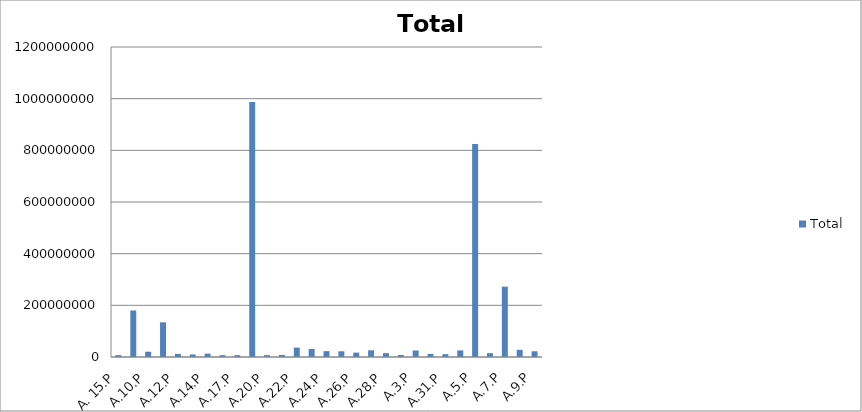
| Category | Total |
|---|---|
| A. 15.P | 7250000 |
| A.1.P | 180160000 |
| A.10.P | 20410000 |
| A.11.P | 134260000 |
| A.12.P | 12065000 |
| A.13.P | 9880000 |
| A.14.P | 12880000 |
| A.16.P | 7065000 |
| A.17.P | 7050000 |
| A.2.P | 986880000 |
| A.20.P | 7120000 |
| A.21.P | 8030000 |
| A.22.P | 36370000 |
| A.23.P | 31300000 |
| A.24.P | 22620000 |
| A.25.P | 22120000 |
| A.26.P | 16950000 |
| A.27.P | 25940000 |
| A.28.P | 15050000 |
| A.29.P | 7660000 |
| A.3.P | 25240000 |
| A.30.P | 11960000 |
| A.31.P | 10930000 |
| A.4.P | 25460000 |
| A.5.P | 824180000 |
| A.6.P | 14980000 |
| A.7.P | 272200000 |
| A.8.P | 27790000 |
| A.9.P | 22210000 |